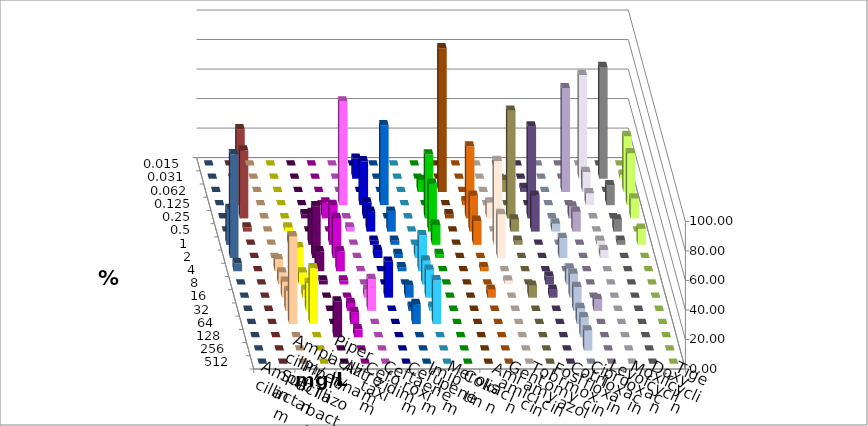
| Category | Ampicillin | Ampicillin/ Sulbactam | Piperacillin | Piperacillin/ Tazobactam | Aztreonam | Cefotaxim | Ceftazidim | Cefuroxim | Imipenem | Meropenem | Colistin | Amikacin | Gentamicin | Tobramycin | Fosfomycin | Cotrimoxazol | Ciprofloxacin | Levofloxacin | Moxifloxacin | Doxycyclin | Tigecyclin |
|---|---|---|---|---|---|---|---|---|---|---|---|---|---|---|---|---|---|---|---|---|---|
| 0.015 | 0 | 0 | 0 | 0 | 0 | 0 | 0 | 0 | 0 | 0 | 0 | 0 | 0 | 0 | 0 | 0 | 0 | 0 | 0 | 0 | 0 |
| 0.031 | 0 | 0 | 0 | 0 | 0 | 13.514 | 0 | 0 | 0 | 0 | 0 | 0 | 0 | 0 | 0 | 0 | 70.27 | 75.676 | 2.703 | 0 | 0 |
| 0.062 | 0 | 0 | 0 | 0 | 0 | 0 | 0 | 0 | 8.108 | 97.297 | 0 | 0 | 8.108 | 2.703 | 0 | 70.27 | 13.514 | 0 | 37.838 | 0 | 0 |
| 0.125 | 0 | 0 | 0 | 0 | 70.27 | 29.73 | 54.054 | 0 | 0 | 0 | 2.703 | 0 | 0 | 0 | 0 | 0 | 8.108 | 13.514 | 35.135 | 0 | 51.351 |
| 0.25 | 0 | 0 | 2.703 | 10.811 | 0 | 10.811 | 0 | 0 | 43.243 | 2.703 | 48.649 | 10.811 | 72.973 | 62.162 | 0 | 8.108 | 0 | 0 | 13.514 | 0 | 45.946 |
| 0.5 | 0 | 2.703 | 0 | 0 | 2.703 | 13.514 | 13.514 | 0 | 32.432 | 0 | 24.324 | 0 | 8.108 | 24.324 | 5.405 | 13.514 | 0 | 8.108 | 0 | 0 | 2.703 |
| 1.0 | 0 | 5.405 | 21.622 | 27.027 | 0 | 2.703 | 2.703 | 0 | 13.514 | 0 | 16.216 | 56.757 | 2.703 | 0 | 0 | 0 | 2.703 | 2.703 | 10.811 | 24.324 | 0 |
| 2.0 | 0 | 5.405 | 35.135 | 27.027 | 0 | 5.405 | 2.703 | 8.108 | 2.703 | 0 | 0 | 29.73 | 0 | 0 | 13.514 | 0 | 5.405 | 0 | 0 | 70.27 | 0 |
| 4.0 | 8.108 | 16.216 | 13.514 | 13.514 | 0 | 0 | 2.703 | 24.324 | 0 | 0 | 2.703 | 0 | 0 | 0 | 0 | 0 | 0 | 0 | 0 | 5.405 | 0 |
| 8.0 | 8.108 | 8.108 | 2.703 | 2.703 | 0 | 0 | 0 | 16.216 | 0 | 0 | 0 | 2.703 | 0 | 5.405 | 10.811 | 0 | 0 | 0 | 0 | 0 | 0 |
| 16.0 | 10.811 | 5.405 | 0 | 0 | 5.405 | 24.324 | 8.108 | 18.919 | 0 | 0 | 5.405 | 0 | 8.108 | 5.405 | 16.216 | 0 | 0 | 0 | 0 | 0 | 0 |
| 32.0 | 13.514 | 18.919 | 0 | 5.405 | 21.622 | 0 | 2.703 | 2.703 | 0 | 0 | 0 | 0 | 0 | 0 | 16.216 | 8.108 | 0 | 0 | 0 | 0 | 0 |
| 64.0 | 59.459 | 37.838 | 0 | 8.108 | 0 | 0 | 13.514 | 29.73 | 0 | 0 | 0 | 0 | 0 | 0 | 10.811 | 0 | 0 | 0 | 0 | 0 | 0 |
| 128.0 | 0 | 0 | 24.324 | 5.405 | 0 | 0 | 0 | 0 | 0 | 0 | 0 | 0 | 0 | 0 | 13.514 | 0 | 0 | 0 | 0 | 0 | 0 |
| 256.0 | 0 | 0 | 0 | 0 | 0 | 0 | 0 | 0 | 0 | 0 | 0 | 0 | 0 | 0 | 13.514 | 0 | 0 | 0 | 0 | 0 | 0 |
| 512.0 | 0 | 0 | 0 | 0 | 0 | 0 | 0 | 0 | 0 | 0 | 0 | 0 | 0 | 0 | 0 | 0 | 0 | 0 | 0 | 0 | 0 |